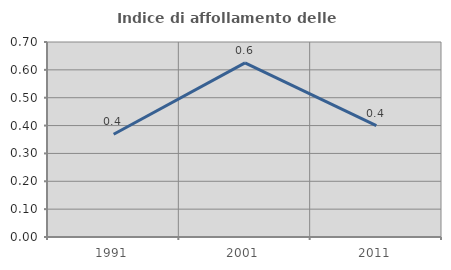
| Category | Indice di affollamento delle abitazioni  |
|---|---|
| 1991.0 | 0.369 |
| 2001.0 | 0.625 |
| 2011.0 | 0.4 |